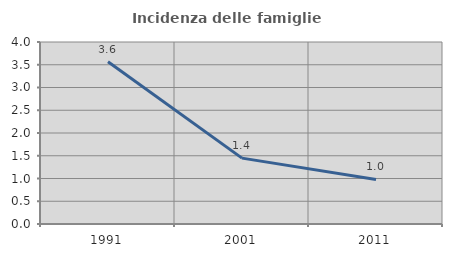
| Category | Incidenza delle famiglie numerose |
|---|---|
| 1991.0 | 3.568 |
| 2001.0 | 1.448 |
| 2011.0 | 0.979 |